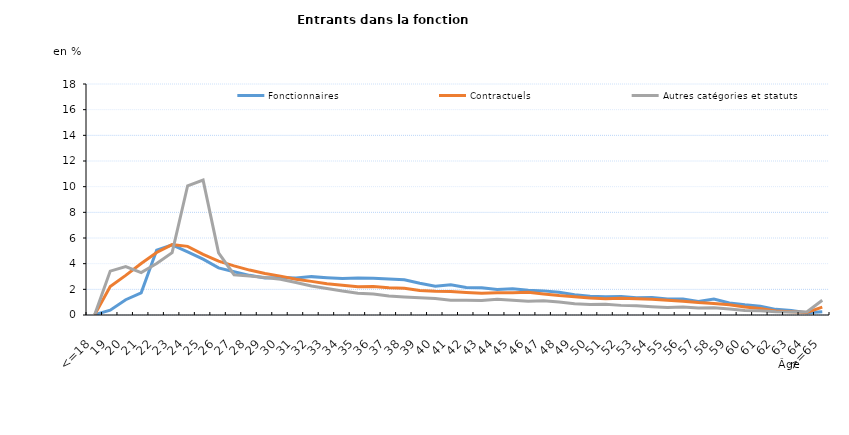
| Category | Fonctionnaires | Contractuels | Autres catégories et statuts |
|---|---|---|---|
| <=18 | 0.03 | 0.03 | 0.03 |
| 19 | 0.38 | 2.22 | 3.42 |
| 20 | 1.19 | 3.09 | 3.78 |
| 21 | 1.73 | 4.01 | 3.3 |
| 22 | 5.05 | 4.87 | 4.01 |
| 23 | 5.46 | 5.49 | 4.86 |
| 24 | 4.92 | 5.35 | 10.07 |
| 25 | 4.35 | 4.73 | 10.51 |
| 26 | 3.67 | 4.2 | 4.84 |
| 27 | 3.37 | 3.83 | 3.14 |
| 28 | 3.09 | 3.5 | 3.04 |
| 29 | 2.89 | 3.24 | 2.93 |
| 30 | 2.93 | 3.03 | 2.79 |
| 31 | 2.88 | 2.79 | 2.53 |
| 32 | 2.99 | 2.62 | 2.26 |
| 33 | 2.91 | 2.43 | 2.07 |
| 34 | 2.85 | 2.31 | 1.87 |
| 35 | 2.89 | 2.2 | 1.7 |
| 36 | 2.87 | 2.23 | 1.63 |
| 37 | 2.8 | 2.13 | 1.48 |
| 38 | 2.75 | 2.09 | 1.41 |
| 39 | 2.47 | 1.91 | 1.35 |
| 40 | 2.25 | 1.85 | 1.28 |
| 41 | 2.35 | 1.83 | 1.15 |
| 42 | 2.14 | 1.75 | 1.14 |
| 43 | 2.12 | 1.69 | 1.13 |
| 44 | 1.99 | 1.73 | 1.23 |
| 45 | 2.05 | 1.74 | 1.15 |
| 46 | 1.92 | 1.77 | 1.07 |
| 47 | 1.88 | 1.64 | 1.11 |
| 48 | 1.77 | 1.52 | 1.01 |
| 49 | 1.58 | 1.43 | 0.87 |
| 50 | 1.46 | 1.32 | 0.81 |
| 51 | 1.43 | 1.26 | 0.83 |
| 52 | 1.44 | 1.31 | 0.75 |
| 53 | 1.35 | 1.26 | 0.72 |
| 54 | 1.37 | 1.22 | 0.65 |
| 55 | 1.25 | 1.15 | 0.58 |
| 56 | 1.24 | 1.07 | 0.62 |
| 57 | 1.06 | 0.97 | 0.54 |
| 58 | 1.24 | 0.9 | 0.56 |
| 59 | 0.94 | 0.79 | 0.47 |
| 60 | 0.79 | 0.63 | 0.36 |
| 61 | 0.69 | 0.5 | 0.34 |
| 62 | 0.44 | 0.32 | 0.26 |
| 63 | 0.36 | 0.26 | 0.24 |
| 64 | 0.17 | 0.2 | 0.23 |
| >=65 | 0.25 | 0.61 | 1.15 |